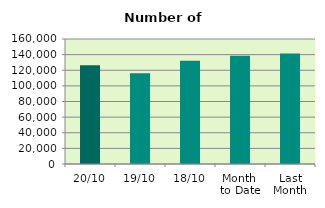
| Category | Series 0 |
|---|---|
| 20/10 | 126404 |
| 19/10 | 116128 |
| 18/10 | 132252 |
| Month 
to Date | 138454.143 |
| Last
Month | 141428.727 |